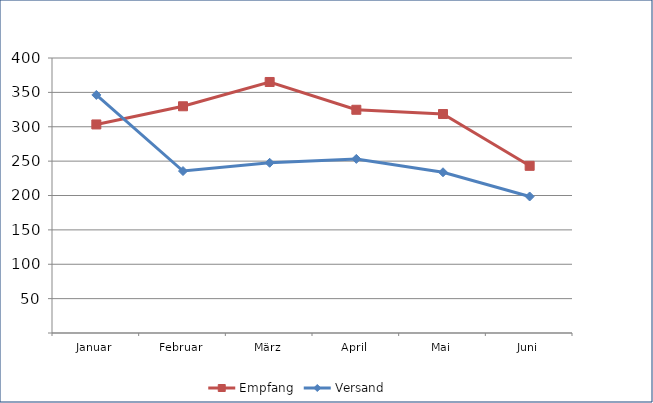
| Category | Empfang | Versand |
|---|---|---|
| Januar | 303.363 | 346.268 |
| Februar | 329.775 | 235.549 |
| März | 365.118 | 247.589 |
| April | 324.704 | 253.239 |
| Mai | 318.502 | 233.806 |
| Juni | 243.151 | 198.565 |